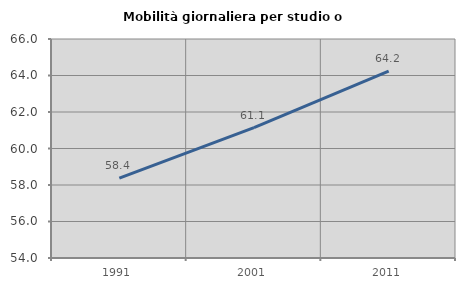
| Category | Mobilità giornaliera per studio o lavoro |
|---|---|
| 1991.0 | 58.377 |
| 2001.0 | 61.149 |
| 2011.0 | 64.242 |